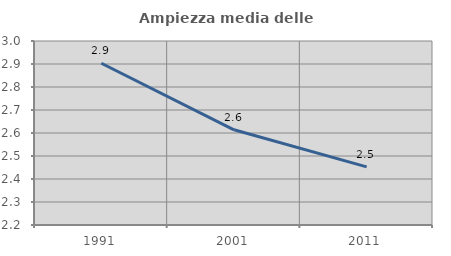
| Category | Ampiezza media delle famiglie |
|---|---|
| 1991.0 | 2.903 |
| 2001.0 | 2.614 |
| 2011.0 | 2.453 |